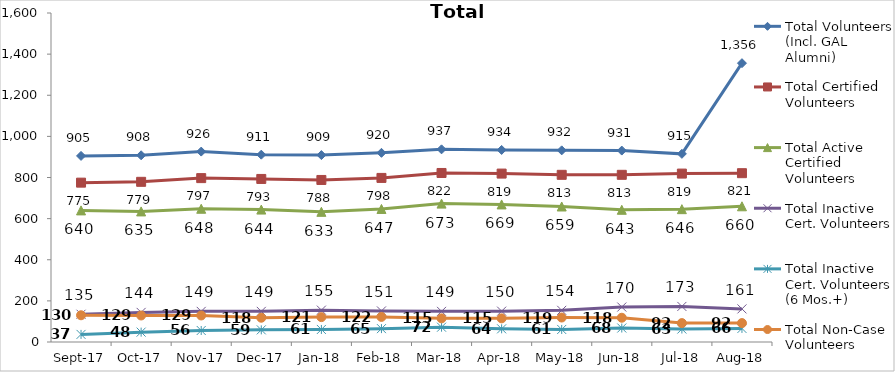
| Category | Total Volunteers (Incl. GAL Alumni) | Total Certified Volunteers | Total Active Certified Volunteers | Total Inactive Cert. Volunteers | Total Inactive Cert. Volunteers (6 Mos.+) | Total Non-Case Volunteers |
|---|---|---|---|---|---|---|
| 2017-09-01 | 905 | 775 | 640 | 135 | 37 | 130 |
| 2017-10-01 | 908 | 779 | 635 | 144 | 48 | 129 |
| 2017-11-01 | 926 | 797 | 648 | 149 | 56 | 129 |
| 2017-12-01 | 911 | 793 | 644 | 149 | 59 | 118 |
| 2018-01-01 | 909 | 788 | 633 | 155 | 61 | 121 |
| 2018-02-01 | 920 | 798 | 647 | 151 | 65 | 122 |
| 2018-03-01 | 937 | 822 | 673 | 149 | 72 | 115 |
| 2018-04-01 | 934 | 819 | 669 | 150 | 64 | 115 |
| 2018-05-01 | 932 | 813 | 659 | 154 | 61 | 119 |
| 2018-06-01 | 931 | 813 | 643 | 170 | 68 | 118 |
| 2018-07-01 | 915 | 819 | 646 | 173 | 63 | 92 |
| 2018-08-01 | 1356 | 821 | 660 | 161 | 66 | 92 |